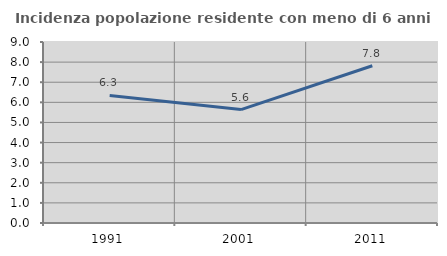
| Category | Incidenza popolazione residente con meno di 6 anni |
|---|---|
| 1991.0 | 6.345 |
| 2001.0 | 5.639 |
| 2011.0 | 7.817 |